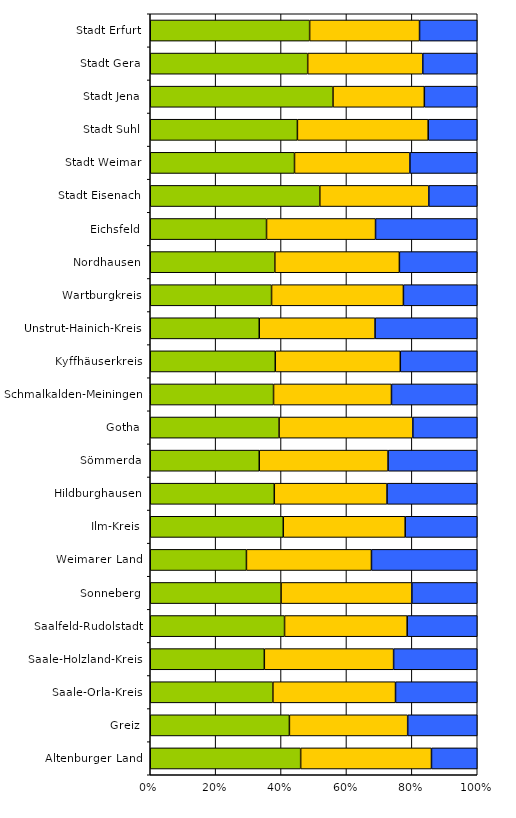
| Category | Series 0 | Series 1 | Series 2 |
|---|---|---|---|
| Altenburger Land | 23 | 20 | 7 |
| Greiz | 20 | 17 | 10 |
| Saale-Orla-Kreis | 15 | 15 | 10 |
| Saale-Holzland-Kreis | 15 | 17 | 11 |
| Saalfeld-Rudolstadt | 23 | 21 | 12 |
| Sonneberg | 12 | 12 | 6 |
| Weimarer Land | 10 | 13 | 11 |
| Ilm-Kreis | 24 | 22 | 13 |
| Hildburghausen | 11 | 10 | 8 |
| Sömmerda | 11 | 13 | 9 |
| Gotha | 26 | 27 | 13 |
| Schmalkalden-Meiningen | 23 | 22 | 16 |
| Kyffhäuserkreis | 13 | 13 | 8 |
| Unstrut-Hainich-Kreis | 16 | 17 | 15 |
| Wartburgkreis | 23 | 25 | 14 |
| Nordhausen | 16 | 16 | 10 |
| Eichsfeld | 16 | 15 | 14 |
| Stadt Eisenach | 14 | 9 | 4 |
| Stadt Weimar | 15 | 12 | 7 |
| Stadt Suhl | 9 | 8 | 3 |
| Stadt Jena | 38 | 19 | 11 |
| Stadt Gera | 26 | 19 | 9 |
| Stadt Erfurt | 58 | 40 | 21 |